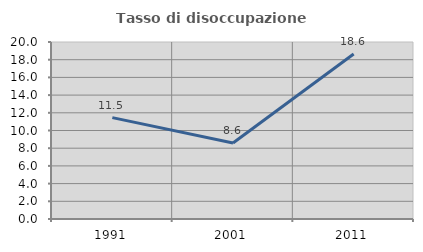
| Category | Tasso di disoccupazione giovanile  |
|---|---|
| 1991.0 | 11.454 |
| 2001.0 | 8.594 |
| 2011.0 | 18.644 |